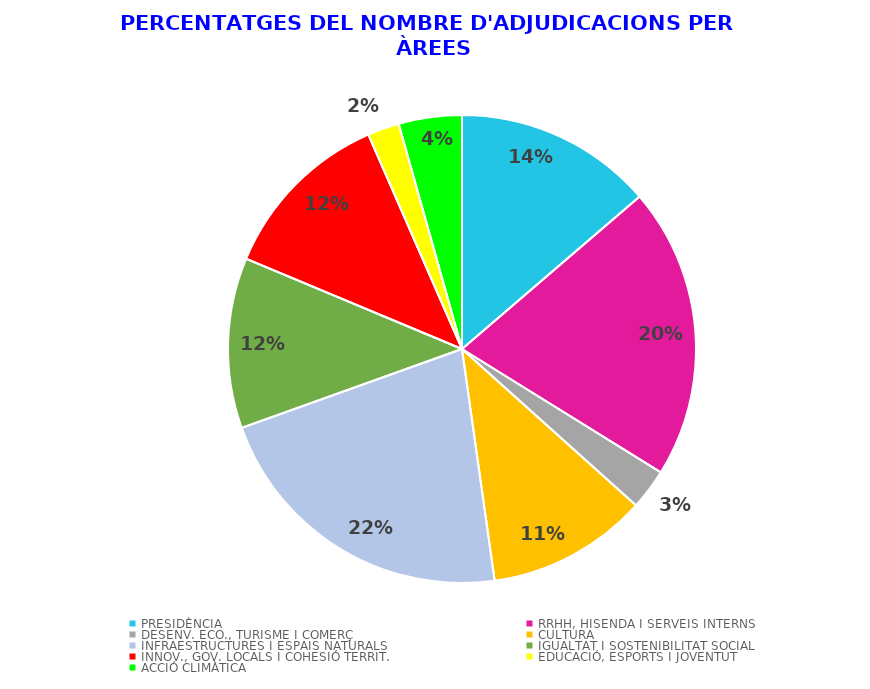
| Category | Series 0 |
|---|---|
| PRESIDÈNCIA | 2219 |
| RRHH, HISENDA I SERVEIS INTERNS | 3257 |
| DESENV. ECO., TURISME I COMERÇ | 455 |
| CULTURA | 1799 |
| INFRAESTRUCTURES I ESPAIS NATURALS | 3521 |
| IGUALTAT I SOSTENIBILITAT SOCIAL | 1905 |
| INNOV., GOV. LOCALS I COHESIÓ TERRIT. | 1965 |
| EDUCACIÓ, ESPORTS I JOVENTUT | 355 |
| ACCIÓ CLIMÀTICA | 706 |